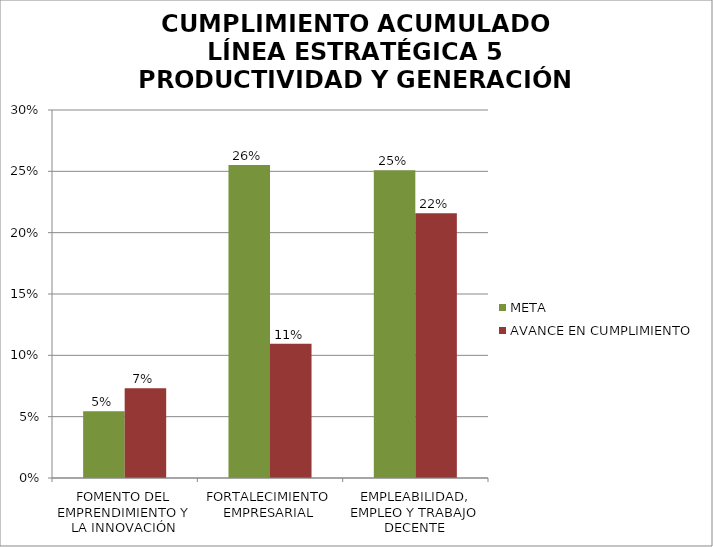
| Category | META | AVANCE EN CUMPLIMIENTO |
|---|---|---|
| FOMENTO DEL EMPRENDIMIENTO Y LA INNOVACIÓN | 0.054 | 0.073 |
| FORTALECIMIENTO EMPRESARIAL | 0.255 | 0.11 |
| EMPLEABILIDAD, EMPLEO Y TRABAJO DECENTE | 0.251 | 0.216 |